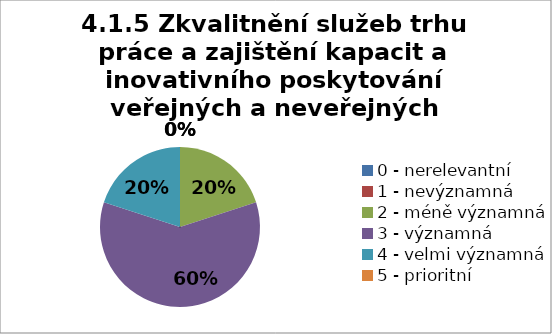
| Category | Series 5 | Series 4 | Series 3 | Series 2 | Series 1 | Series 0 |
|---|---|---|---|---|---|---|
| 0 - nerelevantní | 0 | 6.667 | 0 | 0 | 0 | 0 |
| 1 - nevýznamná | 0 | 6.667 | 0 | 6.667 | 0 | 0 |
| 2 - méně významná | 20 | 33.333 | 26.667 | 0 | 6.667 | 0 |
| 3 - významná | 60 | 40 | 46.667 | 53.333 | 46.667 | 33.333 |
| 4 - velmi významná | 20 | 13.333 | 13.333 | 40 | 33.333 | 40 |
| 5 - prioritní | 0 | 0 | 13.333 | 0 | 13.333 | 26.667 |